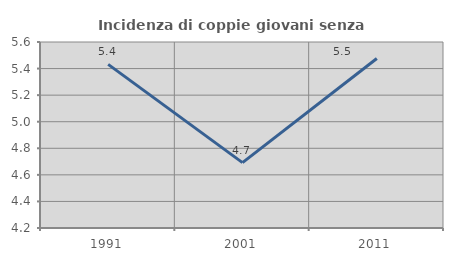
| Category | Incidenza di coppie giovani senza figli |
|---|---|
| 1991.0 | 5.431 |
| 2001.0 | 4.692 |
| 2011.0 | 5.476 |